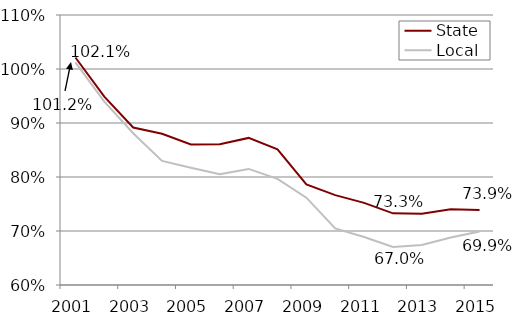
| Category | State | Local |
|---|---|---|
| 2001.0 | 1.021 | 1.012 |
| 2002.0 | 0.949 | 0.939 |
| 2003.0 | 0.892 | 0.881 |
| 2004.0 | 0.88 | 0.83 |
| 2005.0 | 0.86 | 0.817 |
| 2006.0 | 0.861 | 0.805 |
| 2007.0 | 0.872 | 0.815 |
| 2008.0 | 0.851 | 0.796 |
| 2009.0 | 0.786 | 0.762 |
| 2010.0 | 0.766 | 0.705 |
| 2011.0 | 0.752 | 0.689 |
| 2012.0 | 0.733 | 0.67 |
| 2013.0 | 0.732 | 0.674 |
| 2014.0 | 0.74 | 0.688 |
| 2015.0 | 0.739 | 0.699 |